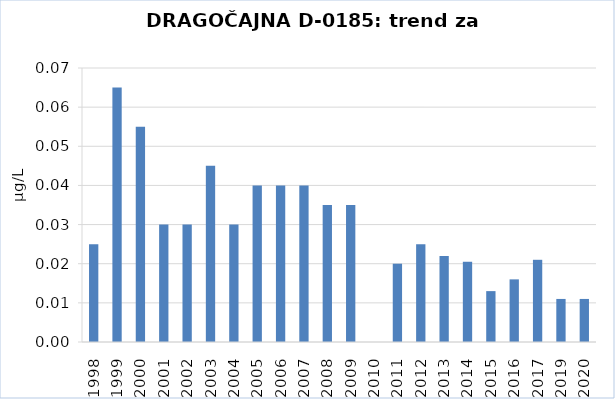
| Category | Vsota |
|---|---|
| 1998 | 0.025 |
| 1999 | 0.065 |
| 2000 | 0.055 |
| 2001 | 0.03 |
| 2002 | 0.03 |
| 2003 | 0.045 |
| 2004 | 0.03 |
| 2005 | 0.04 |
| 2006 | 0.04 |
| 2007 | 0.04 |
| 2008 | 0.035 |
| 2009 | 0.035 |
| 2010 | 0 |
| 2011 | 0.02 |
| 2012 | 0.025 |
| 2013 | 0.022 |
| 2014 | 0.02 |
| 2015 | 0.013 |
| 2016 | 0.016 |
| 2017 | 0.021 |
| 2019 | 0.011 |
| 2020 | 0.011 |